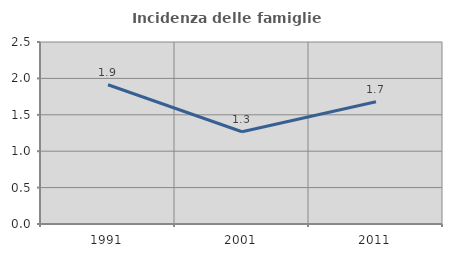
| Category | Incidenza delle famiglie numerose |
|---|---|
| 1991.0 | 1.913 |
| 2001.0 | 1.267 |
| 2011.0 | 1.68 |